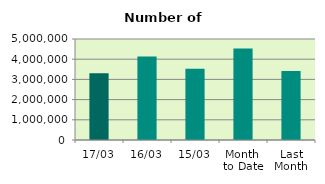
| Category | Series 0 |
|---|---|
| 17/03 | 3310288 |
| 16/03 | 4131916 |
| 15/03 | 3532970 |
| Month 
to Date | 4526607.538 |
| Last
Month | 3413232.3 |